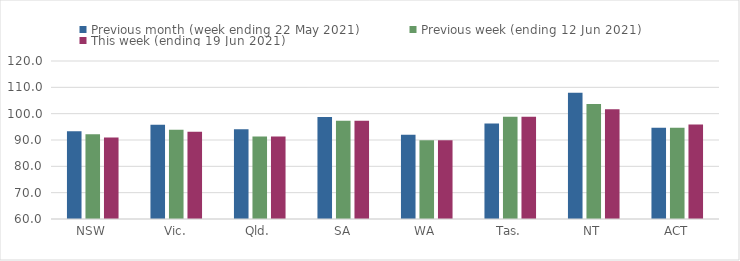
| Category | Previous month (week ending 22 May 2021) | Previous week (ending 12 Jun 2021) | This week (ending 19 Jun 2021) |
|---|---|---|---|
| NSW | 93.32 | 92.2 | 90.96 |
| Vic. | 95.76 | 93.85 | 93.14 |
| Qld. | 94.09 | 91.3 | 91.3 |
| SA | 98.74 | 97.27 | 97.27 |
| WA | 92 | 89.93 | 89.93 |
| Tas. | 96.22 | 98.79 | 98.79 |
| NT | 107.97 | 103.65 | 101.66 |
| ACT | 94.67 | 94.67 | 95.92 |